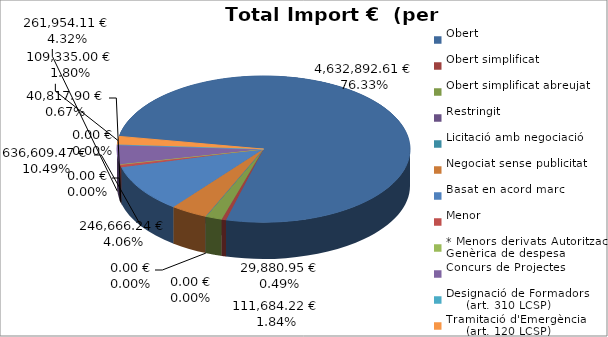
| Category | Total preu
(amb IVA) |
|---|---|
| Obert | 4632892.613 |
| Obert simplificat | 29880.95 |
| Obert simplificat abreujat | 111684.222 |
| Restringit | 0 |
| Licitació amb negociació | 0 |
| Negociat sense publicitat | 246666.244 |
| Basat en acord marc | 636609.471 |
| Menor | 40817.898 |
| * Menors derivats Autorització Genèrica de despesa | 0 |
| Concurs de Projectes | 261954.11 |
| Designació de Formadors
     (art. 310 LCSP) | 0 |
| Tramitació d'Emergència
     (art. 120 LCSP) | 109334.995 |